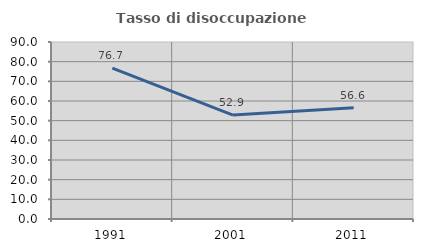
| Category | Tasso di disoccupazione giovanile  |
|---|---|
| 1991.0 | 76.667 |
| 2001.0 | 52.857 |
| 2011.0 | 56.604 |